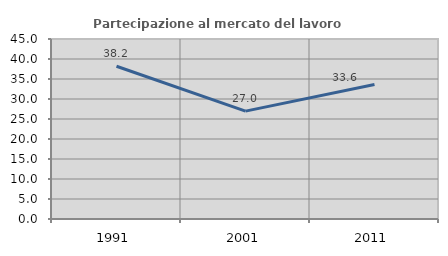
| Category | Partecipazione al mercato del lavoro  femminile |
|---|---|
| 1991.0 | 38.185 |
| 2001.0 | 26.964 |
| 2011.0 | 33.636 |